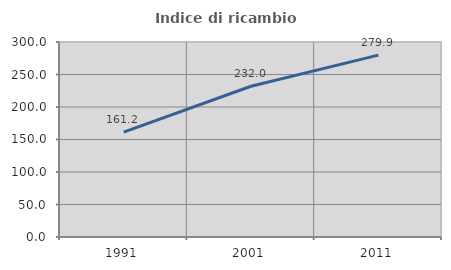
| Category | Indice di ricambio occupazionale  |
|---|---|
| 1991.0 | 161.24 |
| 2001.0 | 231.97 |
| 2011.0 | 279.856 |